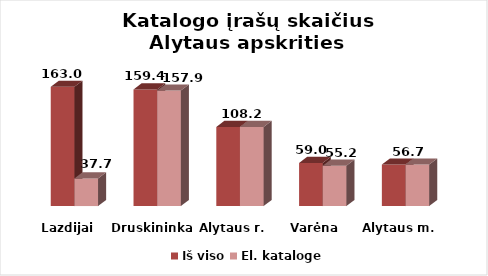
| Category | Iš viso | El. kataloge |
|---|---|---|
| Lazdijai | 163 | 37.7 |
| Druskininkai | 159.4 | 157.9 |
| Alytaus r. | 108.2 | 108.2 |
| Varėna | 59 | 55.2 |
| Alytaus m. | 56.7 | 56.7 |